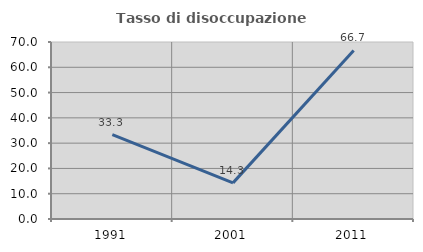
| Category | Tasso di disoccupazione giovanile  |
|---|---|
| 1991.0 | 33.333 |
| 2001.0 | 14.286 |
| 2011.0 | 66.667 |